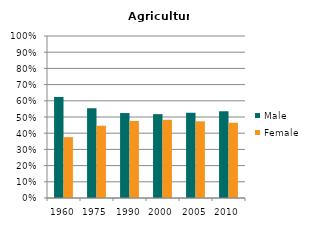
| Category | Male | Female |
|---|---|---|
| 1960.0 | 0.624 | 0.376 |
| 1975.0 | 0.554 | 0.446 |
| 1990.0 | 0.524 | 0.476 |
| 2000.0 | 0.518 | 0.482 |
| 2005.0 | 0.526 | 0.474 |
| 2010.0 | 0.535 | 0.465 |